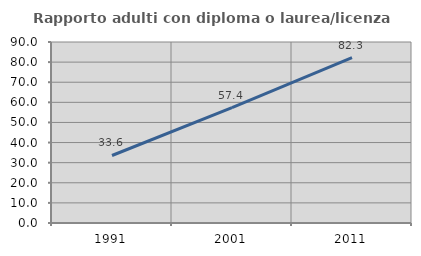
| Category | Rapporto adulti con diploma o laurea/licenza media  |
|---|---|
| 1991.0 | 33.571 |
| 2001.0 | 57.405 |
| 2011.0 | 82.251 |